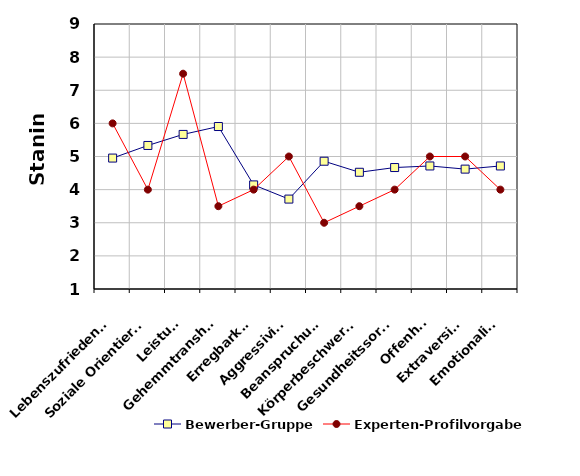
| Category | Bewerber-Gruppe | Experten-Profilvorgabe |
|---|---|---|
| Lebenszufriedenheit | 4.952 | 6 |
| Soziale Orientierung | 5.333 | 4 |
| Leistung | 5.667 | 7.5 |
| Gehemmtransheit | 5.905 | 3.5 |
| Erregbarkeit | 4.143 | 4 |
| Aggressivität | 3.714 | 5 |
| Beanspruchung | 4.857 | 3 |
| Körperbeschwerden | 4.524 | 3.5 |
| Gesundheitssorgen | 4.667 | 4 |
| Offenheit | 4.714 | 5 |
| Extraversion | 4.619 | 5 |
| Emotionalität | 4.714 | 4 |